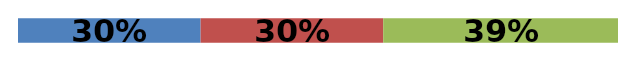
| Category | Series 0 | Series 1 | Series 2 |
|---|---|---|---|
| 0 | 0.304 | 0.304 | 0.391 |